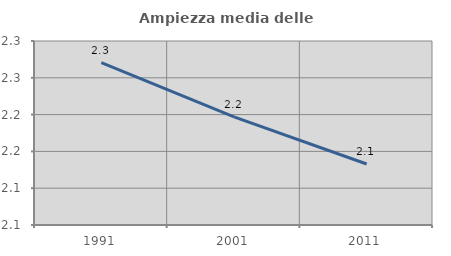
| Category | Ampiezza media delle famiglie |
|---|---|
| 1991.0 | 2.271 |
| 2001.0 | 2.197 |
| 2011.0 | 2.133 |